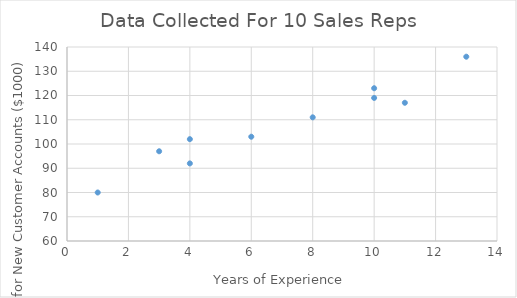
| Category | Annual Sales for New Customer Accounts ($1000) |
|---|---|
| 1.0 | 80 |
| 3.0 | 97 |
| 4.0 | 92 |
| 4.0 | 102 |
| 6.0 | 103 |
| 8.0 | 111 |
| 10.0 | 119 |
| 10.0 | 123 |
| 11.0 | 117 |
| 13.0 | 136 |